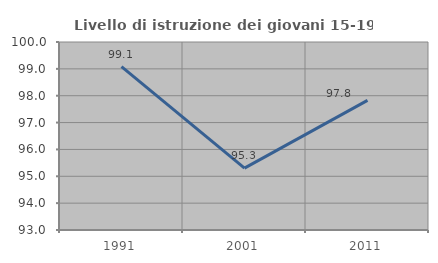
| Category | Livello di istruzione dei giovani 15-19 anni |
|---|---|
| 1991.0 | 99.083 |
| 2001.0 | 95.302 |
| 2011.0 | 97.826 |